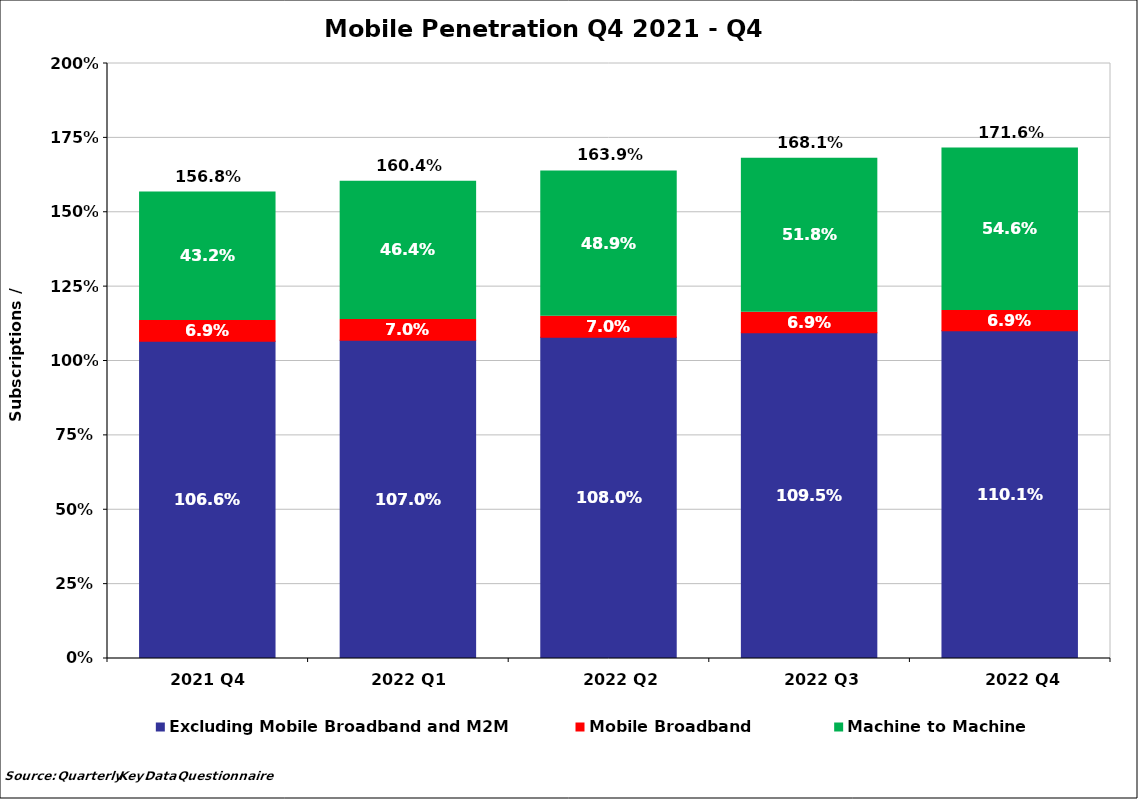
| Category | Excluding Mobile Broadband and M2M | Mobile Broadband | Machine to Machine |
|---|---|---|---|
| 2021 Q4  | 1.066 | 0.069 | 0.432 |
| 2022 Q1  | 1.07 | 0.07 | 0.464 |
| 2022 Q2 | 1.08 | 0.07 | 0.489 |
| 2022 Q3 | 1.095 | 0.069 | 0.518 |
| 2022 Q4 | 1.101 | 0.069 | 0.546 |